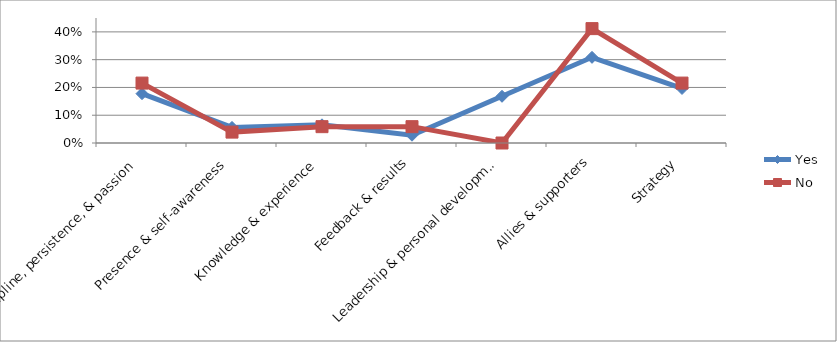
| Category | Yes | No |
|---|---|---|
| Discipline, persistence, & passion | 0.178 | 0.216 |
| Presence & self-awareness | 0.056 | 0.039 |
| Knowledge & experience | 0.065 | 0.059 |
| Feedback & results | 0.028 | 0.059 |
| Leadership & personal development | 0.168 | 0 |
| Allies & supporters | 0.308 | 0.412 |
| Strategy | 0.196 | 0.216 |